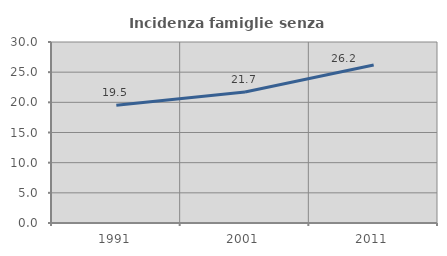
| Category | Incidenza famiglie senza nuclei |
|---|---|
| 1991.0 | 19.517 |
| 2001.0 | 21.713 |
| 2011.0 | 26.174 |